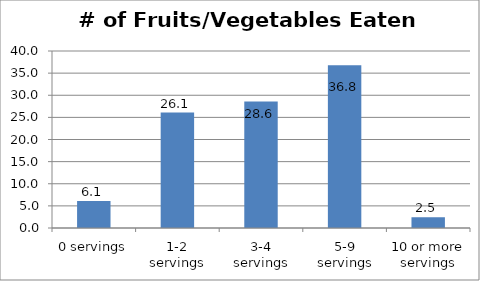
| Category | Series 0 |
|---|---|
| 0 servings | 6.103 |
| 1-2 servings | 26.08 |
| 3-4 servings | 28.592 |
| 5-9 servings | 36.77 |
| 10 or more servings | 2.455 |